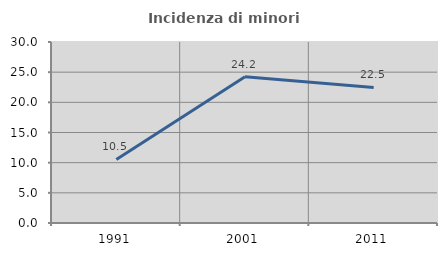
| Category | Incidenza di minori stranieri |
|---|---|
| 1991.0 | 10.526 |
| 2001.0 | 24.242 |
| 2011.0 | 22.46 |